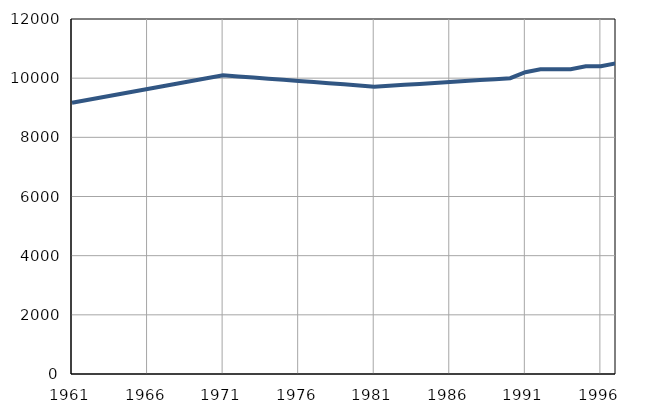
| Category | Број
становника |
|---|---|
| 1961.0 | 9166 |
| 1962.0 | 9259 |
| 1963.0 | 9352 |
| 1964.0 | 9445 |
| 1965.0 | 9538 |
| 1966.0 | 9631 |
| 1967.0 | 9724 |
| 1968.0 | 9817 |
| 1969.0 | 9910 |
| 1970.0 | 10003 |
| 1971.0 | 10095 |
| 1972.0 | 10057 |
| 1973.0 | 10019 |
| 1974.0 | 9981 |
| 1975.0 | 9943 |
| 1976.0 | 9905 |
| 1977.0 | 9867 |
| 1978.0 | 9829 |
| 1979.0 | 9791 |
| 1980.0 | 9753 |
| 1981.0 | 9710 |
| 1982.0 | 9742 |
| 1983.0 | 9774 |
| 1984.0 | 9806 |
| 1985.0 | 9838 |
| 1986.0 | 9870 |
| 1987.0 | 9902 |
| 1988.0 | 9934 |
| 1989.0 | 9966 |
| 1990.0 | 9998 |
| 1991.0 | 10200 |
| 1992.0 | 10300 |
| 1993.0 | 10300 |
| 1994.0 | 10300 |
| 1995.0 | 10400 |
| 1996.0 | 10400 |
| 1997.0 | 10500 |